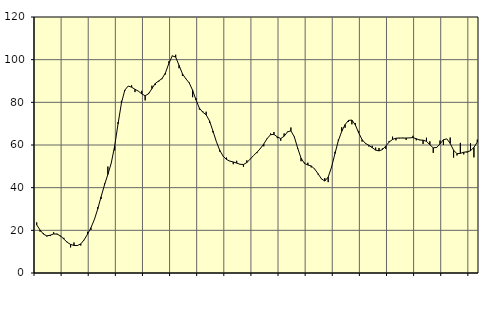
| Category | Piggar | Series 1 |
|---|---|---|
| nan | 23.7 | 22.55 |
| 87.0 | 19.4 | 20.14 |
| 87.0 | 18.7 | 18.22 |
| 87.0 | 17.1 | 17.4 |
| nan | 17.3 | 17.72 |
| 88.0 | 19.1 | 18.3 |
| 88.0 | 18.4 | 18.24 |
| 88.0 | 17.1 | 17.42 |
| nan | 16.5 | 15.93 |
| 89.0 | 14.6 | 14.41 |
| 89.0 | 12 | 13.39 |
| 89.0 | 14.3 | 12.91 |
| nan | 12.7 | 12.88 |
| 90.0 | 12.9 | 13.63 |
| 90.0 | 15.4 | 15.56 |
| 90.0 | 19.3 | 18.2 |
| nan | 20.2 | 21.24 |
| 91.0 | 24.9 | 24.99 |
| 91.0 | 30.9 | 29.95 |
| 91.0 | 34.7 | 35.7 |
| nan | 42 | 41.26 |
| 92.0 | 49.9 | 46.18 |
| 92.0 | 51.5 | 51.53 |
| 92.0 | 57.5 | 59.49 |
| nan | 70.7 | 69.9 |
| 93.0 | 80.7 | 79.64 |
| 93.0 | 85.4 | 85.75 |
| 93.0 | 87.6 | 87.63 |
| nan | 88 | 87.11 |
| 94.0 | 84.8 | 86.11 |
| 94.0 | 85.2 | 85.23 |
| 94.0 | 85.4 | 83.97 |
| nan | 80.9 | 83.08 |
| 95.0 | 84.4 | 83.98 |
| 95.0 | 87.8 | 86.44 |
| 95.0 | 88.1 | 88.86 |
| nan | 89.7 | 90.03 |
| 96.0 | 90.9 | 91.16 |
| 96.0 | 93.1 | 93.89 |
| 96.0 | 99.2 | 98.27 |
| nan | 101.9 | 101.76 |
| 97.0 | 102.3 | 101.25 |
| 97.0 | 96 | 97.34 |
| 97.0 | 92.4 | 93.39 |
| nan | 91.2 | 91.05 |
| 98.0 | 89.3 | 89.11 |
| 98.0 | 82.4 | 85.68 |
| 98.0 | 81.9 | 81.12 |
| nan | 76.6 | 77.28 |
| 99.0 | 75.8 | 75.39 |
| 99.0 | 75.6 | 74.14 |
| 99.0 | 70.3 | 71.28 |
| nan | 65.9 | 66.56 |
| 0.0 | 61.7 | 61.64 |
| 0.0 | 56.9 | 57.53 |
| 0.0 | 54.7 | 54.78 |
| nan | 54.1 | 53.2 |
| 1.0 | 52.4 | 52.45 |
| 1.0 | 51 | 52.05 |
| 1.0 | 52.6 | 51.52 |
| nan | 51 | 50.95 |
| 2.0 | 49.8 | 50.87 |
| 2.0 | 52.8 | 51.75 |
| 2.0 | 53.5 | 53.4 |
| nan | 55.1 | 55.1 |
| 3.0 | 56.2 | 56.61 |
| 3.0 | 58.6 | 58.35 |
| 3.0 | 59.4 | 60.5 |
| nan | 63.2 | 62.99 |
| 4.0 | 65.4 | 64.85 |
| 4.0 | 66.1 | 64.97 |
| 4.0 | 63.2 | 63.8 |
| nan | 62 | 63.02 |
| 5.0 | 65.4 | 64.12 |
| 5.0 | 66.3 | 66.15 |
| 5.0 | 68.2 | 66.63 |
| nan | 63.7 | 63.86 |
| 6.0 | 58.3 | 58.56 |
| 6.0 | 52.4 | 53.82 |
| 6.0 | 51.7 | 51.38 |
| nan | 51.7 | 50.62 |
| 7.0 | 49.5 | 50.18 |
| 7.0 | 48.9 | 48.76 |
| 7.0 | 46.2 | 46.58 |
| nan | 44 | 44.18 |
| 8.0 | 44.5 | 43.1 |
| 8.0 | 42.6 | 44.95 |
| 8.0 | 49.7 | 49.68 |
| nan | 56.8 | 55.94 |
| 9.0 | 62.5 | 62.04 |
| 9.0 | 68.3 | 66.39 |
| 9.0 | 68.1 | 69.58 |
| nan | 70.8 | 71.54 |
| 10.0 | 69.7 | 71.68 |
| 10.0 | 70.3 | 69.47 |
| 10.0 | 66.6 | 65.71 |
| nan | 61.6 | 62.54 |
| 11.0 | 60.6 | 60.76 |
| 11.0 | 59.3 | 59.85 |
| 11.0 | 59.6 | 58.75 |
| nan | 58.8 | 57.61 |
| 12.0 | 58.6 | 57.24 |
| 12.0 | 58.4 | 57.85 |
| 12.0 | 58.2 | 59.51 |
| nan | 61.9 | 61.39 |
| 13.0 | 63.9 | 62.61 |
| 13.0 | 62.2 | 63.18 |
| 13.0 | 63.1 | 63.29 |
| nan | 63.4 | 63.24 |
| 14.0 | 62.4 | 63.26 |
| 14.0 | 63.3 | 63.33 |
| 14.0 | 64.3 | 63.47 |
| nan | 62.2 | 62.94 |
| 15.0 | 62.5 | 62.32 |
| 15.0 | 60.5 | 62.26 |
| 15.0 | 63.4 | 61.74 |
| nan | 61.7 | 60.13 |
| 16.0 | 56.3 | 58.68 |
| 16.0 | 59 | 58.85 |
| 16.0 | 62.1 | 60.51 |
| nan | 60 | 62.46 |
| 17.0 | 62.9 | 62.89 |
| 17.0 | 63.5 | 60.74 |
| 17.0 | 54.1 | 57.55 |
| nan | 55.1 | 55.94 |
| 18.0 | 61 | 56.07 |
| 18.0 | 55.6 | 56.61 |
| 18.0 | 56.4 | 56.82 |
| nan | 60.8 | 57.32 |
| 19.0 | 54.2 | 58.87 |
| 19.0 | 62.5 | 61.39 |